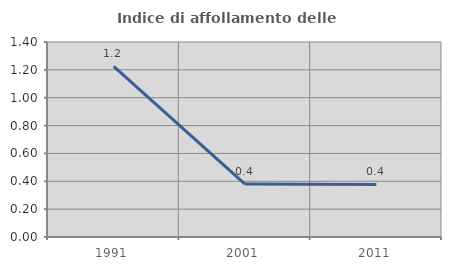
| Category | Indice di affollamento delle abitazioni  |
|---|---|
| 1991.0 | 1.224 |
| 2001.0 | 0.38 |
| 2011.0 | 0.377 |